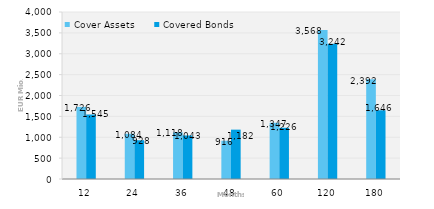
| Category | Cover Assets | Covered Bonds |
|---|---|---|
| 12.0 | 1726.476 | 1545.072 |
| 24.0 | 1083.56 | 928.139 |
| 36.0 | 1117.72 | 1042.6 |
| 48.0 | 915.938 | 1182.113 |
| 60.0 | 1347.004 | 1226.442 |
| 120.0 | 3568.357 | 3241.5 |
| 180.0 | 2391.54 | 1646.126 |